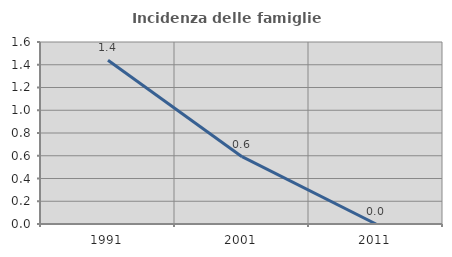
| Category | Incidenza delle famiglie numerose |
|---|---|
| 1991.0 | 1.439 |
| 2001.0 | 0.592 |
| 2011.0 | 0 |